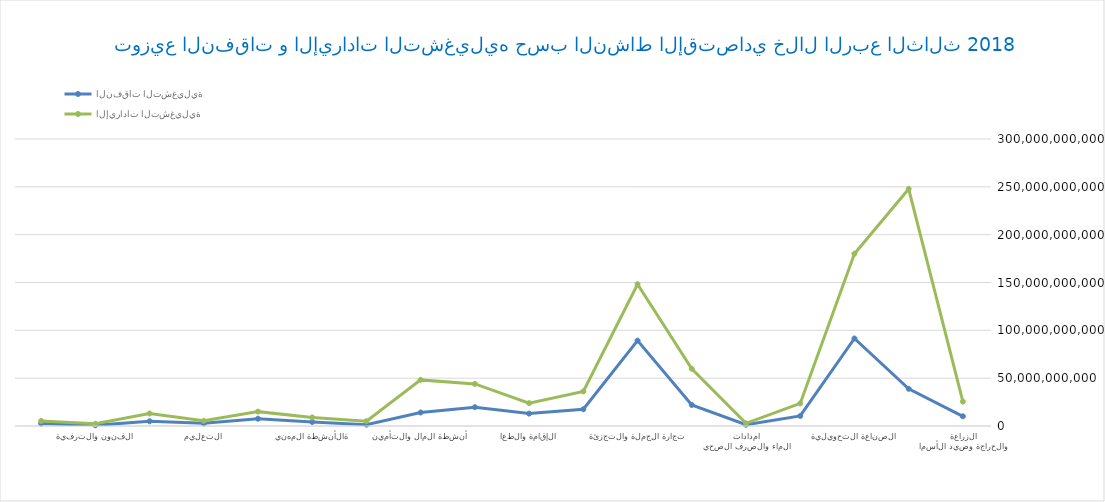
| Category | النفقات التشغيلية | الإيرادات التشغيلية |
|---|---|---|
| الزراعة والحراجة وصيد الأسماك | 10142364874 | 25475012374 |
| التعدين واستغلال المحاجر | 38897215748 | 247805476598 |
| الصناعة التحويلية | 91456321547 | 180124102981 |
| توصيل الكهرباء والغاز  | 10514112484 | 23595001276 |
| امدادات الماء والصرف الصحي | 1326061321 | 2786432859 |
| التشييد | 22013215784 | 59785218746 |
| تجارة الجملة والتجزئة | 89264238749 | 148177142362 |
| النقل والتخزين | 17508451296 | 36178008864 |
| الإقامة والطعام | 12958187951 | 23898362983 |
| المعلومات والاتصالات | 19696142517 | 44022487958 |
| أنشطة المال والتأمين | 14121326521 | 48201114781 |
| الأنشطة العقارية | 1399223614 | 5002087963 |
| الأنشطة المهنية  | 4215421857 | 8978487512 |
| الخدمات الإدارية والدعم | 7597321564 | 15017149635 |
| التعليم | 2790239865 | 5388011879 |
| الصحة والعمل الاجتماعي | 4897041293 | 13079238596 |
| الفنون والترفية | 750700148 | 2316412119 |
| الخدمات الأخرى | 2567195418 | 5242748514 |